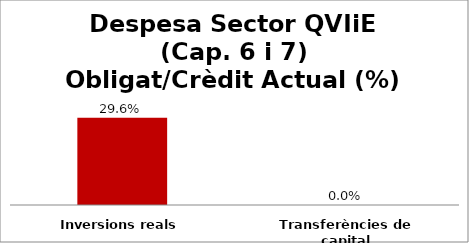
| Category | Series 0 |
|---|---|
| Inversions reals | 0.296 |
| Transferències de capital | 0 |